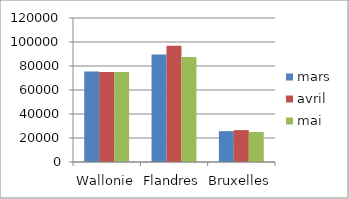
| Category | mars | avril | mai |
|---|---|---|---|
| Wallonie | 75487 | 74945 | 75008 |
| Flandres | 89523 | 96874 | 87420 |
| Bruxelles | 25687 | 26574 | 24987 |